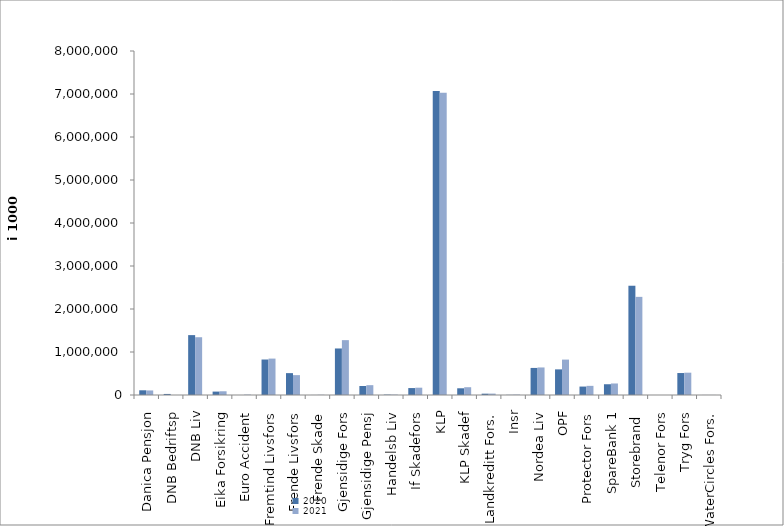
| Category | 2020 | 2021 |
|---|---|---|
| Danica Pensjon | 109603.563 | 105984.141 |
| DNB Bedriftsp | 24444 | 0 |
| DNB Liv | 1392573.169 | 1343575.869 |
| Eika Forsikring | 79342 | 86830 |
| Euro Accident | 0 | 8328 |
| Fremtind Livsfors | 825203.295 | 846741.586 |
| Frende Livsfors | 508634 | 462024 |
| Frende Skade | 838 | 5032.16 |
| Gjensidige Fors | 1082036 | 1275735.117 |
| Gjensidige Pensj | 209475 | 228732 |
| Handelsb Liv | 8969.869 | 8840.216 |
| If Skadefors | 161371.507 | 170115.003 |
| KLP | 7072533.251 | 7029637.715 |
| KLP Skadef | 156137.836 | 181165.234 |
| Landkreditt Fors. | 30906 | 32788 |
| Insr | 3495.948 | 9365 |
| Nordea Liv | 629530.542 | 640623 |
| OPF | 595788.336 | 823365 |
| Protector Fors | 196210.827 | 212752.663 |
| SpareBank 1 | 250321.987 | 267941.328 |
| Storebrand  | 2540938.007 | 2282188.585 |
| Telenor Fors | 0 | 364 |
| Tryg Fors | 510830.812 | 519007.7 |
| WaterCircles Fors. | 1050 | 1478 |